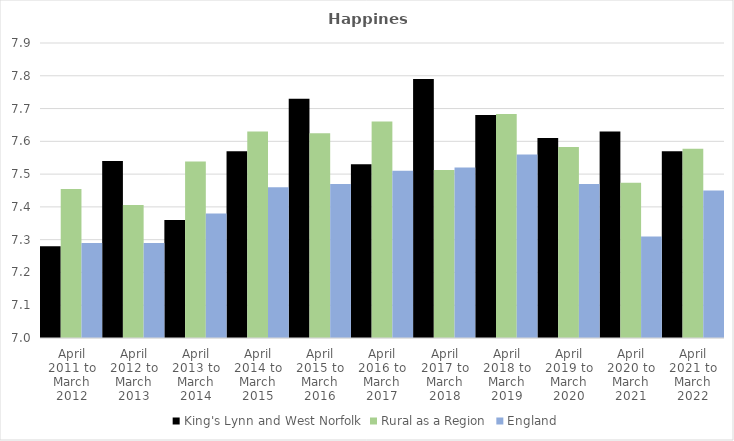
| Category | King's Lynn and West Norfolk | Rural as a Region | England |
|---|---|---|---|
| April 2011 to March 2012 | 7.28 | 7.454 | 7.29 |
| April 2012 to March 2013 | 7.54 | 7.406 | 7.29 |
| April 2013 to March 2014 | 7.36 | 7.539 | 7.38 |
| April 2014 to March 2015 | 7.57 | 7.63 | 7.46 |
| April 2015 to March 2016 | 7.73 | 7.625 | 7.47 |
| April 2016 to March 2017 | 7.53 | 7.661 | 7.51 |
| April 2017 to March 2018 | 7.79 | 7.513 | 7.52 |
| April 2018 to March 2019 | 7.68 | 7.684 | 7.56 |
| April 2019 to March 2020 | 7.61 | 7.582 | 7.47 |
| April 2020 to March 2021 | 7.63 | 7.474 | 7.31 |
| April 2021 to March 2022 | 7.57 | 7.577 | 7.45 |